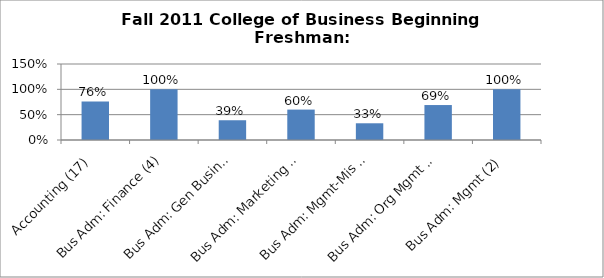
| Category | Series 0 |
|---|---|
| Accounting (17) | 0.76 |
| Bus Adm: Finance (4) | 1 |
| Bus Adm: Gen Business (38) | 0.39 |
| Bus Adm: Marketing (10) | 0.6 |
| Bus Adm: Mgmt-Mis (3) | 0.33 |
| Bus Adm: Org Mgmt (13) | 0.69 |
| Bus Adm: Mgmt (2) | 1 |